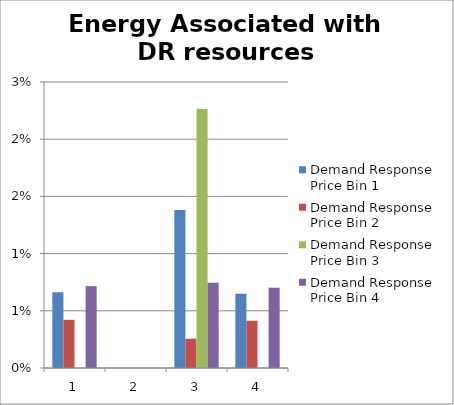
| Category | Demand Response Price Bin 1 | Demand Response Price Bin 2 | Demand Response Price Bin 3 | Demand Response Price Bin 4 |
|---|---|---|---|---|
| 0 | 0.007 | 0.004 | 0 | 0.007 |
| 1 | 0 | 0 | 0 | 0 |
| 2 | 0.014 | 0.003 | 0.023 | 0.007 |
| 3 | 0.006 | 0.004 | 0 | 0.007 |